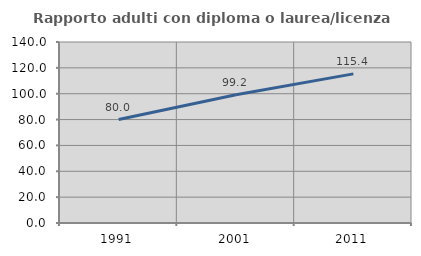
| Category | Rapporto adulti con diploma o laurea/licenza media  |
|---|---|
| 1991.0 | 79.99 |
| 2001.0 | 99.153 |
| 2011.0 | 115.358 |